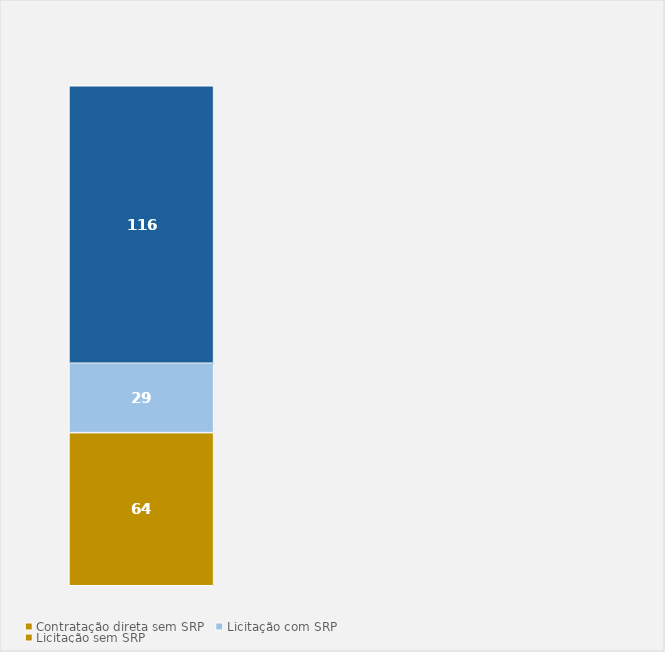
| Category | Contratação direta sem SRP | Licitação com SRP | Licitação sem SRP |
|---|---|---|---|
| Total | 64 | 29 | 116 |